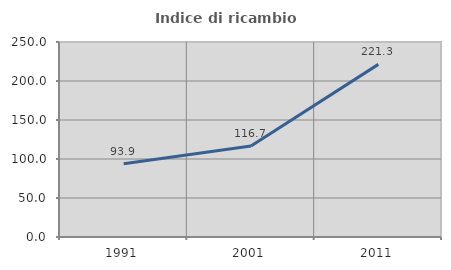
| Category | Indice di ricambio occupazionale  |
|---|---|
| 1991.0 | 93.939 |
| 2001.0 | 116.746 |
| 2011.0 | 221.302 |